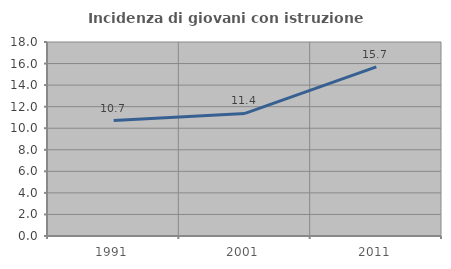
| Category | Incidenza di giovani con istruzione universitaria |
|---|---|
| 1991.0 | 10.714 |
| 2001.0 | 11.374 |
| 2011.0 | 15.698 |